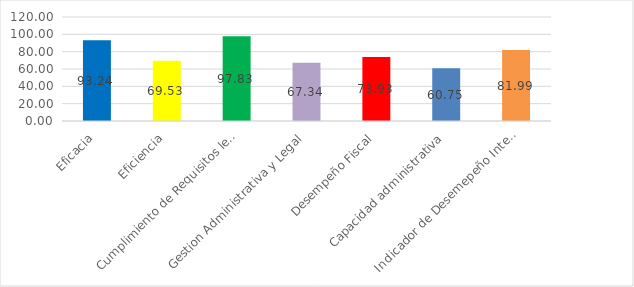
| Category | Series 0 |
|---|---|
| Eficacia | 93.24 |
| Eficiencia | 69.53 |
| Cumplimiento de Requisitos legales | 97.83 |
| Gestion Administrativa y Legal | 67.34 |
| Desempeño Fiscal | 73.93 |
| Capacidad administrativa | 60.75 |
| Indicador de Desemepeño Integral | 81.99 |